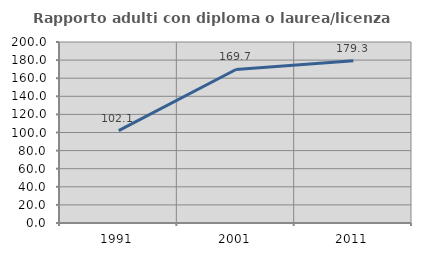
| Category | Rapporto adulti con diploma o laurea/licenza media  |
|---|---|
| 1991.0 | 102.055 |
| 2001.0 | 169.663 |
| 2011.0 | 179.31 |